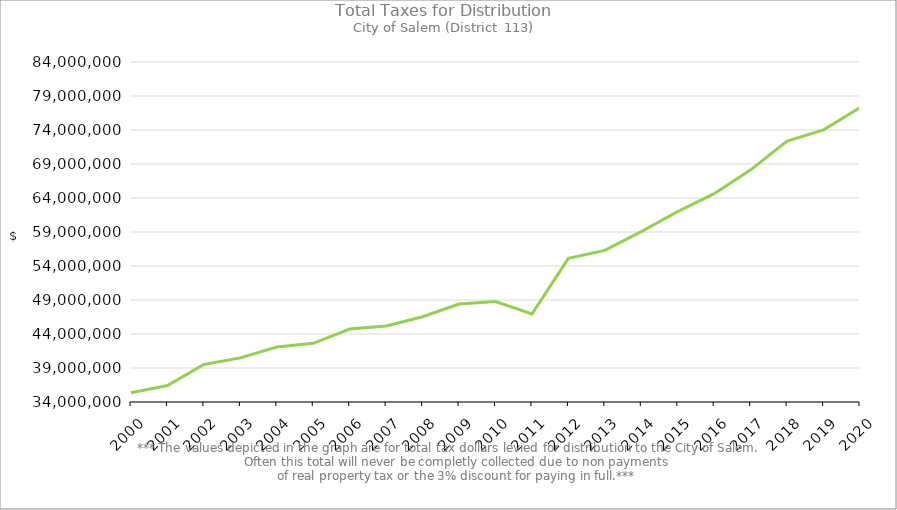
| Category | Tax Dollars Received by The City of Salem |
|---|---|
| 2000.0 | 35366690.11 |
| 2001.0 | 36426757.79 |
| 2002.0 | 39511805.72 |
| 2003.0 | 40492059.16 |
| 2004.0 | 42086959.64 |
| 2005.0 | 42634064.16 |
| 2006.0 | 44723444.02 |
| 2007.0 | 45166841.54 |
| 2008.0 | 46534232.41 |
| 2009.0 | 48398515.68 |
| 2010.0 | 48783242.38 |
| 2011.0 | 46935720.16 |
| 2012.0 | 55131090.06 |
| 2013.0 | 56289154.28 |
| 2014.0 | 59054669.55 |
| 2015.0 | 62009568.9 |
| 2016.0 | 64634453.55 |
| 2017.0 | 68144195.19 |
| 2018.0 | 72354162.18 |
| 2019.0 | 74017735.45 |
| 2020.0 | 77296552.1 |